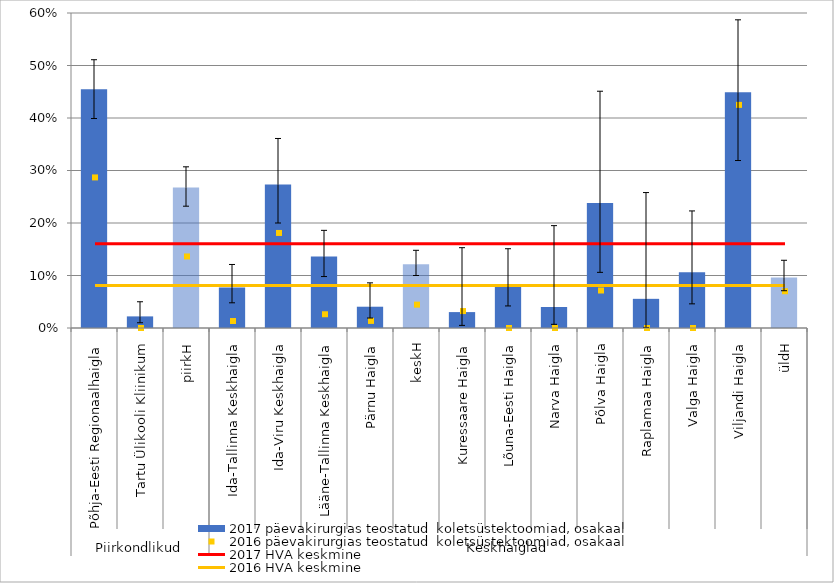
| Category | 2017 päevakirurgias teostatud  koletsüstektoomiad, osakaal |
|---|---|
| 0 | 0.455 |
| 1 | 0.022 |
| 2 | 0.268 |
| 3 | 0.077 |
| 4 | 0.274 |
| 5 | 0.136 |
| 6 | 0.041 |
| 7 | 0.121 |
| 8 | 0.03 |
| 9 | 0.081 |
| 10 | 0.04 |
| 11 | 0.238 |
| 12 | 0.056 |
| 13 | 0.106 |
| 14 | 0.449 |
| 15 | 0.096 |